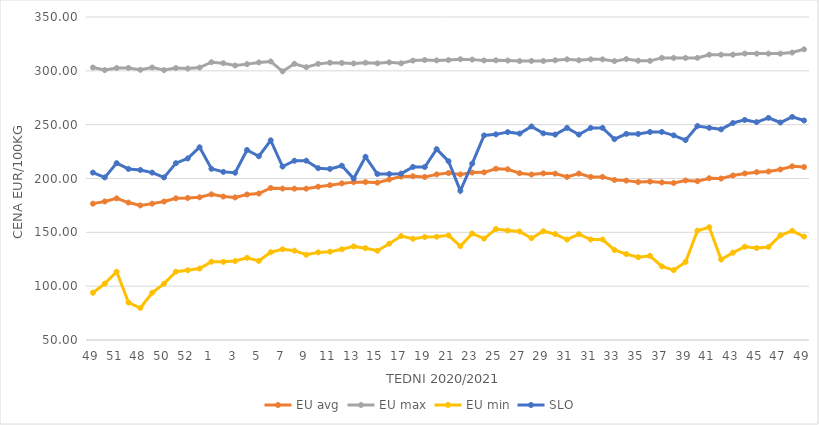
| Category | EU avg | EU max | EU min | SLO |
|---|---|---|---|---|
| 49.0 | 176.65 | 303.09 | 93.873 | 205.48 |
| 50.0 | 178.648 | 300.7 | 102.316 | 200.99 |
| 51.0 | 181.58 | 302.62 | 113.46 | 214.25 |
| 47.0 | 177.656 | 302.7 | 84.832 | 208.87 |
| 48.0 | 174.977 | 300.94 | 79.697 | 207.9 |
| 49.0 | 176.65 | 303.09 | 93.873 | 205.48 |
| 50.0 | 178.648 | 300.7 | 102.316 | 200.99 |
| 51.0 | 181.58 | 302.62 | 113.46 | 214.25 |
| 52.0 | 181.9 | 302.14 | 114.76 | 218.61 |
| 53.0 | 182.536 | 303 | 116.375 | 229 |
| 1.0 | 185.3 | 308 | 122.769 | 209 |
| 2.0 | 183.25 | 307.1 | 122.609 | 206.15 |
| 3.0 | 182.393 | 304.91 | 123.32 | 205.35 |
| 4.0 | 185.158 | 306.22 | 126.329 | 226.48 |
| 5.0 | 186.04 | 307.79 | 123.461 | 220.65 |
| 6.0 | 191.206 | 308.7 | 131.528 | 235.46 |
| 7.0 | 190.629 | 299.55 | 134.262 | 211.1 |
| 8.0 | 190.57 | 306.55 | 132.97 | 216.51 |
| 9.0 | 190.562 | 303.4 | 129.173 | 216.54 |
| 10.0 | 192.373 | 306.48 | 131.374 | 209.61 |
| 11.0 | 193.79 | 307.58 | 132.024 | 208.91 |
| 12.0 | 195.449 | 307.33 | 134.212 | 211.87 |
| 13.0 | 196.631 | 306.85 | 136.936 | 199.93 |
| 14.0 | 196.702 | 307.56 | 135.297 | 220.15 |
| 15.0 | 196.13 | 306.96 | 132.893 | 204.2 |
| 16.0 | 199.1 | 307.87 | 139.462 | 204.2 |
| 17.0 | 201.754 | 306.98 | 146.538 | 204.51 |
| 18.0 | 202.13 | 309.49 | 144.017 | 210.72 |
| 19.0 | 201.439 | 310.06 | 145.644 | 210.68 |
| 20.0 | 203.834 | 309.69 | 145.911 | 227.32 |
| 21.0 | 205.04 | 309.99 | 147.188 | 216.08 |
| 22.0 | 203.79 | 310.76 | 137.177 | 188.6 |
| 23.0 | 205.51 | 310.41 | 148.928 | 213.84 |
| 24.0 | 205.73 | 309.64 | 144.161 | 239.99 |
| 25.0 | 209.095 | 309.74 | 153.081 | 240.99 |
| 26.0 | 208.551 | 309.55 | 151.599 | 243.11 |
| 27.0 | 204.914 | 309.08 | 150.789 | 241.72 |
| 28.0 | 203.681 | 309.21 | 144.56 | 248.33 |
| 29.0 | 204.773 | 309.15 | 151.052 | 241.96 |
| 30.0 | 204.558 | 309.78 | 148.33 | 240.79 |
| 31.0 | 201.483 | 310.67 | 143.33 | 247 |
| 30.0 | 204.558 | 309.78 | 148.33 | 240.79 |
| 31.0 | 201.483 | 310.67 | 143.33 | 247 |
| 32.0 | 201.483 | 310.67 | 143.33 | 247 |
| 33.0 | 198.691 | 309 | 133.607 | 236.54 |
| 34.0 | 198.027 | 310.9 | 129.797 | 241.45 |
| 35.0 | 196.72 | 309.41 | 126.926 | 241.39 |
| 36.0 | 197.157 | 309.28 | 128.099 | 243.19 |
| 37.0 | 196.375 | 312 | 118.364 | 243.28 |
| 38.0 | 195.821 | 312 | 114.892 | 240.06 |
| 39.0 | 198.179 | 312 | 122.517 | 235.66 |
| 40.0 | 197.482 | 312 | 151.488 | 248.77 |
| 41.0 | 200.22 | 315 | 154.74 | 247.07 |
| 42.0 | 199.965 | 315 | 124.748 | 245.64 |
| 43.0 | 202.804 | 315 | 131.104 | 251.53 |
| 44.0 | 204.713 | 316 | 136.6 | 254.42 |
| 45.0 | 205.906 | 316 | 135.362 | 252.35 |
| 46.0 | 206.476 | 316 | 136.39 | 256.33 |
| 47.0 | 208.415 | 316 | 147.192 | 252.01 |
| 48.0 | 211.314 | 317 | 151.41 | 257.25 |
| 49.0 | 210.657 | 320 | 146.064 | 253.87 |